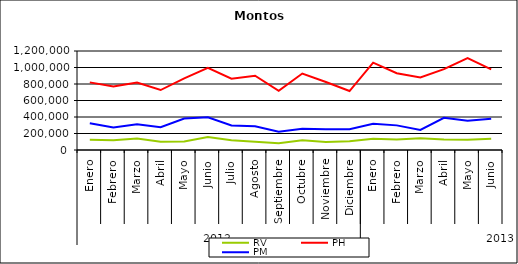
| Category | RV | PH | PM |
|---|---|---|---|
| 0 | 123119.659 | 819877.166 | 324690.254 |
| 1 | 119357.51 | 768583.334 | 272644.496 |
| 2 | 138093.991 | 817068.707 | 312641.558 |
| 3 | 100821.144 | 726813.436 | 276815.26 |
| 4 | 103097.59 | 868125.504 | 381195.355 |
| 5 | 158839.586 | 996800.775 | 396671.19 |
| 6 | 118513.148 | 865093.308 | 296421.982 |
| 7 | 99881.135 | 900298.029 | 288238.176 |
| 8 | 81045.519 | 716357.419 | 222239.842 |
| 9 | 117510.884 | 926749.531 | 256415.725 |
| 10 | 98379.537 | 824327.097 | 252401.818 |
| 11 | 105599.42 | 714733.451 | 252865.789 |
| 12 | 136808.804 | 1058774.967 | 316751.291 |
| 13 | 127193.421 | 930111.334 | 298480.292 |
| 14 | 142052.509 | 880100.908 | 242691.68 |
| 15 | 126637.277 | 980038.371 | 389833.89 |
| 16 | 123189.846 | 1112542.201 | 355777.139 |
| 17 | 135184.022 | 977877.296 | 379782.022 |